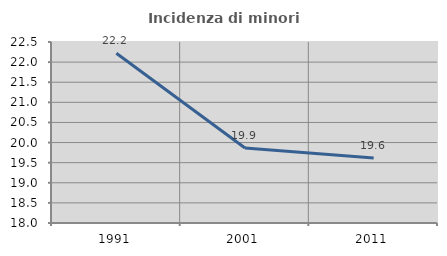
| Category | Incidenza di minori stranieri |
|---|---|
| 1991.0 | 22.222 |
| 2001.0 | 19.866 |
| 2011.0 | 19.617 |